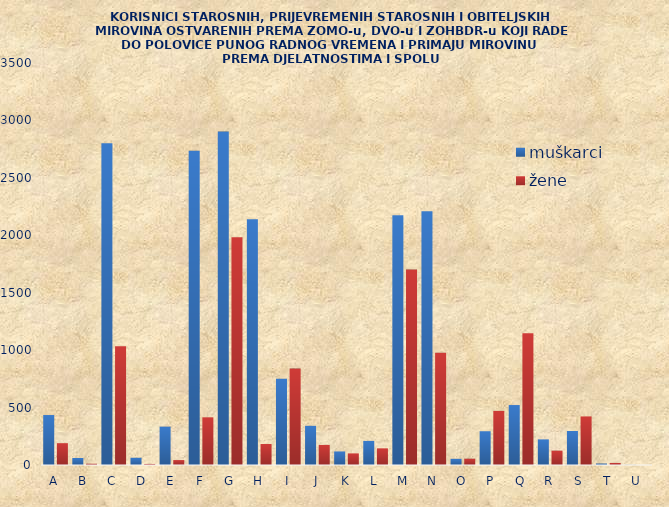
| Category | muškarci | žene |
|---|---|---|
| A | 435 | 190 |
| B | 61 | 11 |
| C | 2802 | 1034 |
| D | 63 | 9 |
| E | 334 | 43 |
| F | 2737 | 415 |
| G | 2903 | 1982 |
| H | 2139 | 183 |
| I | 751 | 840 |
| J | 341 | 175 |
| K | 118 | 101 |
| L | 210 | 145 |
| M | 2174 | 1702 |
| N | 2210 | 978 |
| O | 54 | 55 |
| P | 294 | 471 |
| Q | 522 | 1147 |
| R | 223 | 125 |
| S | 296 | 423 |
| T | 13 | 18 |
| U | 1 | 0 |